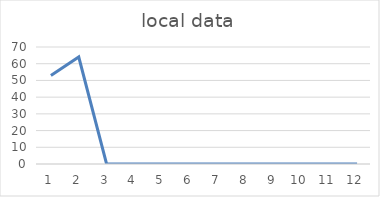
| Category | local data |
|---|---|
| 0 | 53 |
| 1 | 64 |
| 2 | 0 |
| 3 | 0 |
| 4 | 0 |
| 5 | 0 |
| 6 | 0 |
| 7 | 0 |
| 8 | 0 |
| 9 | 0 |
| 10 | 0 |
| 11 | 0 |